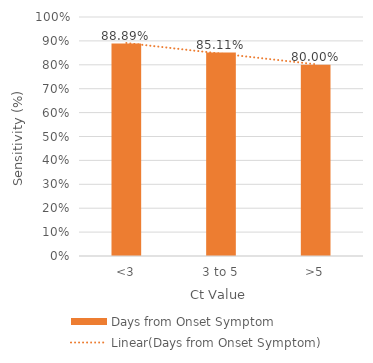
| Category | Days from Onset Symptom |
|---|---|
| <3 | 0.889 |
| 3 to 5 | 0.851 |
| >5 | 0.8 |